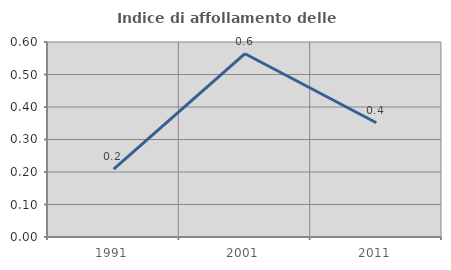
| Category | Indice di affollamento delle abitazioni  |
|---|---|
| 1991.0 | 0.209 |
| 2001.0 | 0.564 |
| 2011.0 | 0.351 |